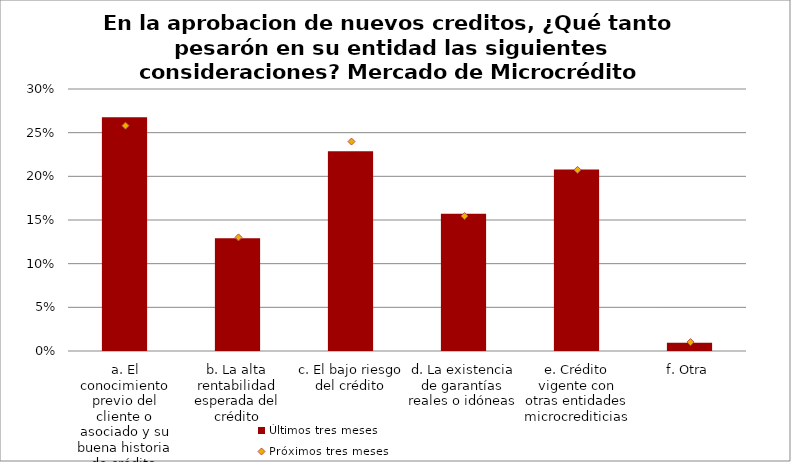
| Category | Últimos tres meses |
|---|---|
| a. El conocimiento previo del cliente o asociado y su buena historia de crédito | 0.268 |
| b. La alta rentabilidad esperada del crédito | 0.129 |
| c. El bajo riesgo del crédito | 0.229 |
| d. La existencia de garantías reales o idóneas | 0.157 |
| e. Crédito vigente con otras entidades microcrediticias | 0.208 |
| f. Otra | 0.01 |